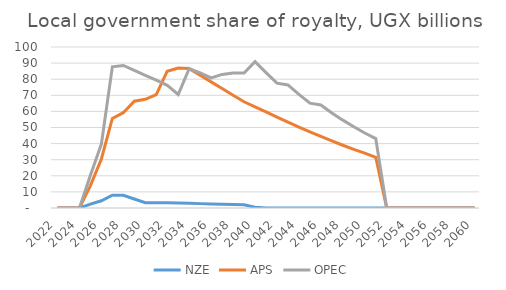
| Category | NZE | APS | OPEC |
|---|---|---|---|
| 2022.0 | 0 | 0 | 0 |
| 2023.0 | 0 | 0 | 0 |
| 2024.0 | 0 | 0 | 0 |
| 2025.0 | 2.417 | 13.896 | 20.302 |
| 2026.0 | 4.486 | 30.45 | 39.735 |
| 2027.0 | 7.926 | 55.626 | 87.68 |
| 2028.0 | 7.926 | 59.193 | 88.511 |
| 2029.0 | 5.611 | 66.344 | 85.412 |
| 2030.0 | 3.288 | 67.507 | 82.389 |
| 2031.0 | 3.284 | 70.365 | 79.44 |
| 2032.0 | 3.274 | 84.973 | 76.166 |
| 2033.0 | 3.144 | 86.99 | 70.482 |
| 2034.0 | 2.95 | 86.587 | 86.587 |
| 2035.0 | 2.718 | 82.499 | 83.861 |
| 2036.0 | 2.51 | 78.343 | 80.792 |
| 2037.0 | 2.311 | 74.179 | 82.987 |
| 2038.0 | 2.132 | 70.053 | 83.912 |
| 2039.0 | 1.961 | 66.001 | 83.807 |
| 2040.0 | 0.533 | 62.854 | 90.883 |
| 2041.0 | 0 | 59.672 | 84.082 |
| 2042.0 | 0 | 56.496 | 77.553 |
| 2043.0 | 0 | 53.359 | 76.442 |
| 2044.0 | 0 | 50.287 | 70.537 |
| 2045.0 | 0 | 47.3 | 65.104 |
| 2046.0 | 0 | 44.414 | 63.956 |
| 2047.0 | 0 | 41.64 | 59.062 |
| 2048.0 | 0 | 38.984 | 54.562 |
| 2049.0 | 0 | 36.454 | 50.419 |
| 2050.0 | 0 | 34.05 | 46.609 |
| 2051.0 | 0 | 31.489 | 43.103 |
| 2052.0 | 0 | 0 | 0 |
| 2053.0 | 0 | 0 | 0 |
| 2054.0 | 0 | 0 | 0 |
| 2055.0 | 0 | 0 | 0 |
| 2056.0 | 0 | 0 | 0 |
| 2057.0 | 0 | 0 | 0 |
| 2058.0 | 0 | 0 | 0 |
| 2059.0 | 0 | 0 | 0 |
| 2060.0 | 0 | 0 | 0 |